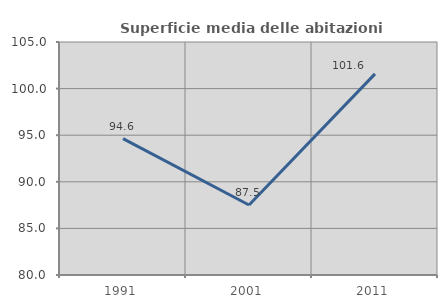
| Category | Superficie media delle abitazioni occupate |
|---|---|
| 1991.0 | 94.632 |
| 2001.0 | 87.511 |
| 2011.0 | 101.577 |